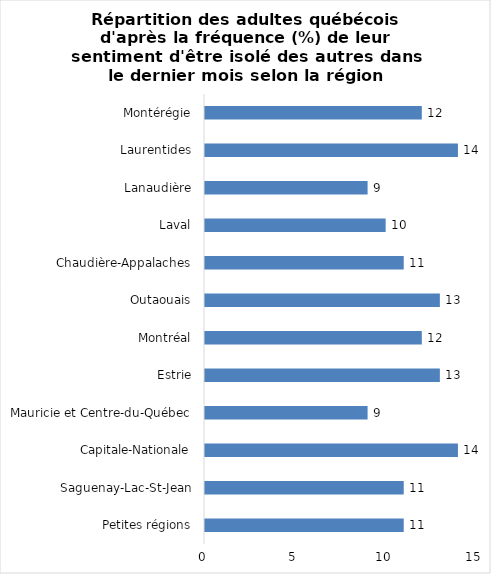
| Category | Series 0 |
|---|---|
| Petites régions | 11 |
| Saguenay-Lac-St-Jean | 11 |
| Capitale-Nationale | 14 |
| Mauricie et Centre-du-Québec | 9 |
| Estrie | 13 |
| Montréal | 12 |
| Outaouais | 13 |
| Chaudière-Appalaches | 11 |
| Laval | 10 |
| Lanaudière | 9 |
| Laurentides | 14 |
| Montérégie | 12 |